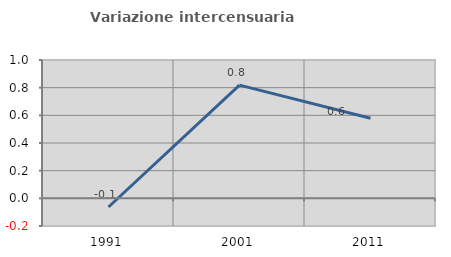
| Category | Variazione intercensuaria annua |
|---|---|
| 1991.0 | -0.063 |
| 2001.0 | 0.818 |
| 2011.0 | 0.579 |